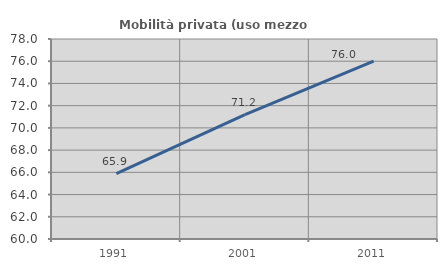
| Category | Mobilità privata (uso mezzo privato) |
|---|---|
| 1991.0 | 65.891 |
| 2001.0 | 71.196 |
| 2011.0 | 76 |